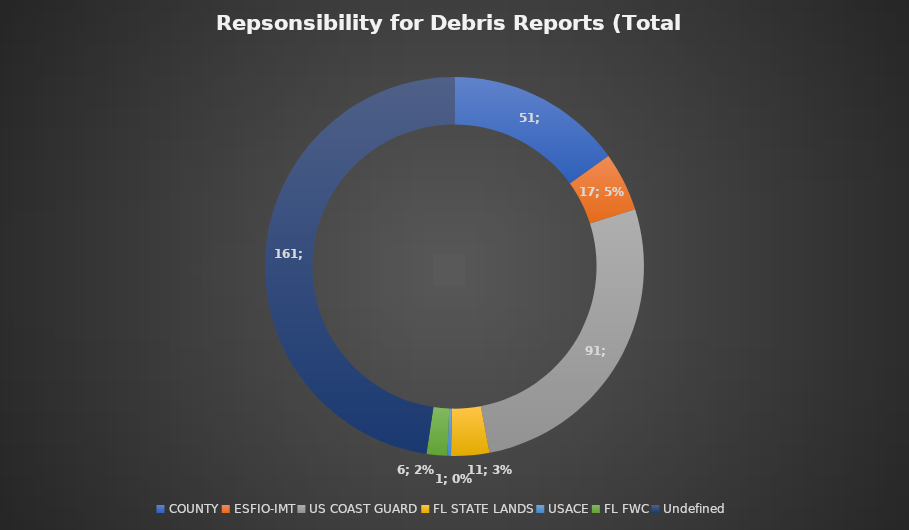
| Category | Repsonsibility for Debris Report |
|---|---|
| COUNTY | 51 |
| ESFIO-IMT | 17 |
| US COAST GUARD | 91 |
| FL STATE LANDS | 11 |
| USACE | 1 |
| FL FWC | 6 |
| Undefined | 161 |